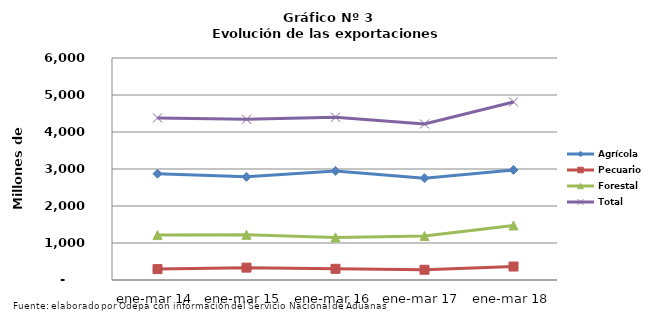
| Category | Agrícola | Pecuario | Forestal | Total |
|---|---|---|---|---|
| ene-mar 14 | 2872362 | 294279 | 1214556 | 4381197 |
| ene-mar 15 | 2787931 | 334076 | 1222173 | 4344180 |
| ene-mar 16 | 2946300 | 302652 | 1151680 | 4400632 |
| ene-mar 17 | 2751458 | 277112 | 1187824 | 4216394 |
| ene-mar 18 | 2974938 | 363977 | 1473565 | 4812480 |